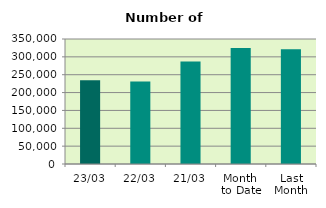
| Category | Series 0 |
|---|---|
| 23/03 | 234352 |
| 22/03 | 230962 |
| 21/03 | 287062 |
| Month 
to Date | 324869.765 |
| Last
Month | 321374.6 |